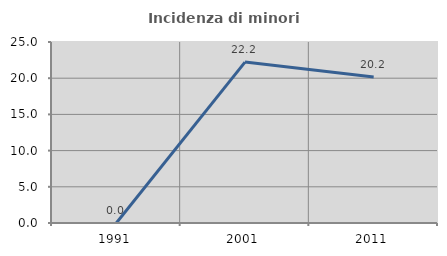
| Category | Incidenza di minori stranieri |
|---|---|
| 1991.0 | 0 |
| 2001.0 | 22.222 |
| 2011.0 | 20.161 |